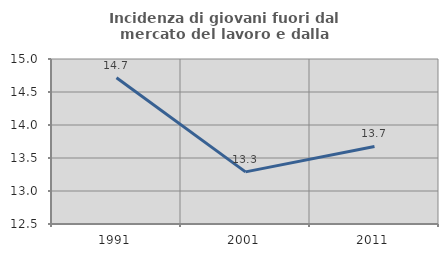
| Category | Incidenza di giovani fuori dal mercato del lavoro e dalla formazione  |
|---|---|
| 1991.0 | 14.715 |
| 2001.0 | 13.29 |
| 2011.0 | 13.675 |